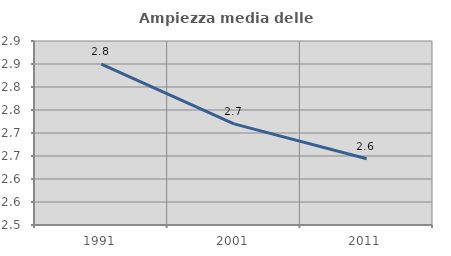
| Category | Ampiezza media delle famiglie |
|---|---|
| 1991.0 | 2.85 |
| 2001.0 | 2.72 |
| 2011.0 | 2.644 |